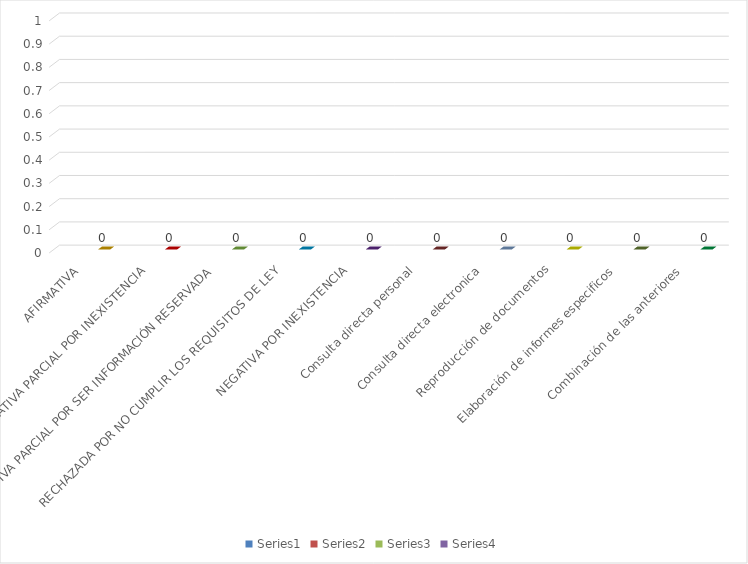
| Category | Series 0 | Series 1 | Series 2 | Series 3 |
|---|---|---|---|---|
| AFIRMATIVA |  |  |  | 0 |
| AFIRMATIVA PARCIAL POR INEXISTENCIA |  |  |  | 0 |
| AFIRMATIVA PARCIAL POR SER INFORMACIÓN RESERVADA |  |  |  | 0 |
| RECHAZADA POR NO CUMPLIR LOS REQUISITOS DE LEY |  |  |  | 0 |
| NEGATIVA POR INEXISTENCIA |  |  |  | 0 |
| Consulta directa personal |  |  |  | 0 |
| Consulta directa electronica |  |  |  | 0 |
| Reproducción de documentos |  |  |  | 0 |
| Elaboración de informes especificos |  |  |  | 0 |
| Combinación de las anteriores |  |  |  | 0 |